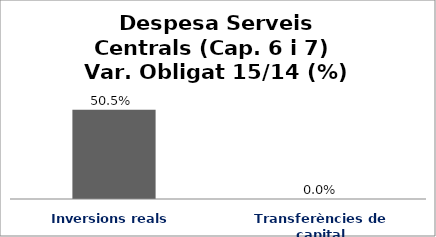
| Category | Series 0 |
|---|---|
| Inversions reals | 0.505 |
| Transferències de capital | 0 |